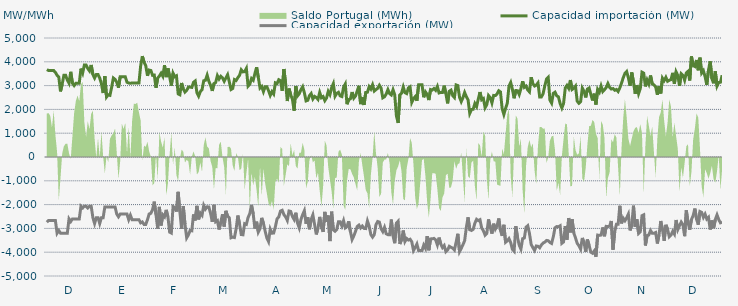
| Category | Capacidad importación (MW) | Capacidad exportación (MW) |
|---|---|---|
| 0 | 3670.833 | -2741.667 |
| 1900-01-01 | 3633.333 | -2666.667 |
| 1900-01-02 | 3633.333 | -2666.667 |
| 1900-01-03 | 3633.333 | -2666.667 |
| 1900-01-04 | 3633.333 | -2666.667 |
| 1900-01-05 | 3557.083 | -2666.667 |
| 1900-01-06 | 3433.333 | -3200 |
| 1900-01-07 | 3358.333 | -3087.5 |
| 1900-01-08 | 2756.25 | -3200 |
| 1900-01-09 | 3066.667 | -3200 |
| 1900-01-10 | 3433.333 | -3200 |
| 1900-01-11 | 3433.333 | -3200 |
| 1900-01-12 | 3232.417 | -3200 |
| 1900-01-13 | 3100 | -2600 |
| 1900-01-14 | 3579.167 | -2712.5 |
| 1900-01-15 | 3100 | -2600 |
| 1900-01-16 | 3000.75 | -2600 |
| 1900-01-17 | 3100 | -2600 |
| 1900-01-18 | 3100 | -2600 |
| 1900-01-19 | 3100 | -2600 |
| 1900-01-20 | 3712.917 | -2066.667 |
| 1900-01-21 | 3527.083 | -2141.667 |
| 1900-01-22 | 3866.667 | -2066.667 |
| 1900-01-23 | 3866.667 | -2066.667 |
| 1900-01-24 | 3716.667 | -2141.667 |
| 1900-01-25 | 3616.667 | -2066.667 |
| 1900-01-26 | 3866.667 | -2066.667 |
| 1900-01-27 | 3466.667 | -2550 |
| 1900-01-28 | 3316.667 | -2795.833 |
| 1900-01-29 | 3466.667 | -2550 |
| 1900-01-30 | 3466.667 | -2550 |
| 1900-01-31 | 3316.667 | -2795.833 |
| 1900-02-01 | 3082.167 | -2550 |
| 1900-02-02 | 2687.5 | -2550 |
| 1900-02-03 | 3400 | -2100 |
| 1900-02-04 | 2520.833 | -2100 |
| 1900-02-05 | 2614.583 | -2100 |
| 1900-02-06 | 2591.25 | -2100 |
| 1900-02-07 | 2932.083 | -2100 |
| 1900-02-08 | 3318.75 | -2100 |
| 1900-02-09 | 3262.5 | -2100 |
| 1900-02-10 | 3139.583 | -2400 |
| 1900-02-11 | 2912.5 | -2512.5 |
| 1900-02-12 | 3366.667 | -2400 |
| 1900-02-13 | 3366.667 | -2400 |
| 1900-02-14 | 3366.667 | -2400 |
| 1900-02-15 | 3366.667 | -2400 |
| 1900-02-16 | 3139.583 | -2400 |
| 1900-02-17 | 3108.333 | -2633.333 |
| 1900-02-18 | 3100 | -2445.833 |
| 1900-02-19 | 3108.333 | -2633.333 |
| 1900-02-20 | 3108.333 | -2633.333 |
| 1900-02-21 | 3108.333 | -2633.333 |
| 1900-02-22 | 3108.333 | -2633.333 |
| 1900-02-23 | 3108.333 | -2633.333 |
| 1900-02-24 | 3822.917 | -2766.667 |
| 1900-02-25 | 4239.583 | -2729.167 |
| 1900-02-26 | 3979.167 | -2833.333 |
| 1900-02-27 | 3841.667 | -2833.333 |
| 1900-02-28 | 3414.375 | -2634.375 |
| 1900-02-28 | 3652.5 | -2392.5 |
| 1900-03-01 | 3633.75 | -2364.375 |
| 1900-03-02 | 3431.25 | -2212.5 |
| 1900-03-03 | 3442.5 | -1876.875 |
| 1900-03-04 | 2908.125 | -2420.625 |
| 1900-03-05 | 3318.75 | -3009.375 |
| 1900-03-06 | 3401.25 | -2096.25 |
| 1900-03-07 | 3519.375 | -2876.25 |
| 1900-03-08 | 3392.5 | -2430 |
| 1900-03-09 | 3856.875 | -2512.5 |
| 1900-03-10 | 3356.25 | -2221.875 |
| 1900-03-11 | 3727.5 | -2516.25 |
| 1900-03-12 | 3372.5 | -3157.5 |
| 1900-03-13 | 3000.208 | -3195 |
| 1900-03-14 | 3522.083 | -2079.375 |
| 1900-03-15 | 3371.667 | -2122.5 |
| 1900-03-16 | 3412.5 | -2291.25 |
| 1900-03-17 | 2653.125 | -1464.375 |
| 1900-03-18 | 2615 | -2298.75 |
| 1900-03-19 | 3110.625 | -3018.75 |
| 1900-03-20 | 2861.792 | -2062.5 |
| 1900-03-21 | 2726.042 | -2823.75 |
| 1900-03-22 | 2799.583 | -3397.5 |
| 1900-03-23 | 2936.25 | -3273.75 |
| 1900-03-24 | 2938.125 | -3091.875 |
| 1900-03-25 | 2925 | -3101.25 |
| 1900-03-26 | 3136.875 | -2413.125 |
| 1900-03-27 | 3195.208 | -2666.25 |
| 1900-03-28 | 2702.083 | -2053.125 |
| 1900-03-29 | 2556.042 | -2621.25 |
| 1900-03-30 | 2748.75 | -2355 |
| 1900-03-31 | 2825.625 | -2448.75 |
| 1900-04-01 | 3204.375 | -2034.375 |
| 1900-04-02 | 3223.333 | -2188.125 |
| 1900-04-03 | 3440.625 | -2092.5 |
| 1900-04-04 | 3180 | -2100 |
| 1900-04-05 | 3016.875 | -2368.125 |
| 1900-04-06 | 2777.292 | -2722.5 |
| 1900-04-07 | 3084.375 | -2008.125 |
| 1900-04-08 | 3130.833 | -2720.625 |
| 1900-04-09 | 3418.75 | -2671.875 |
| 1900-04-10 | 3277.917 | -3046.875 |
| 1900-04-11 | 3390.833 | -2735.625 |
| 1900-04-12 | 3326.25 | -2407.5 |
| 1900-04-13 | 3180 | -2921.25 |
| 1900-04-14 | 3320.625 | -2262.708 |
| 1900-04-15 | 3457.5 | -2488.125 |
| 1900-04-16 | 3158.75 | -2557.5 |
| 1900-04-17 | 2836.25 | -3393.75 |
| 1900-04-18 | 2879.167 | -3365.625 |
| 1900-04-19 | 3254.167 | -3384.375 |
| 1900-04-20 | 3214.167 | -3018.75 |
| 1900-04-21 | 3335.625 | -2460 |
| 1900-04-22 | 3429.375 | -2818.125 |
| 1900-04-23 | 3663.75 | -3258.75 |
| 1900-04-24 | 3577.583 | -3268.125 |
| 1900-04-25 | 3586.875 | -2801.25 |
| 1900-04-26 | 3721.875 | -2831.25 |
| 1900-04-27 | 2977.5 | -2542.5 |
| 1900-04-28 | 3058.043 | -2379.13 |
| 1900-04-29 | 3294.375 | -2013.75 |
| 1900-04-30 | 3223.125 | -2388.75 |
| 1900-05-01 | 3506.25 | -3005.625 |
| 1900-05-02 | 3770.625 | -2718.75 |
| 1900-05-03 | 3346.875 | -3153.75 |
| 1900-05-04 | 2898.75 | -3009.375 |
| 1900-05-05 | 2966.25 | -2556.708 |
| 1900-05-06 | 2745.417 | -2786.25 |
| 1900-05-07 | 2951.25 | -3112.083 |
| 1900-05-08 | 2955 | -3401.25 |
| 1900-05-09 | 2788.125 | -3553.125 |
| 1900-05-10 | 2587.5 | -3033.75 |
| 1900-05-11 | 2745 | -3200.625 |
| 1900-05-12 | 2645.625 | -3195 |
| 1900-05-13 | 3116.25 | -2932.5 |
| 1900-05-14 | 3084.375 | -2598.75 |
| 1900-05-15 | 3247.5 | -2520 |
| 1900-05-16 | 3208.125 | -2272.5 |
| 1900-05-17 | 2782.708 | -2238.75 |
| 1900-05-18 | 3697.5 | -2418.75 |
| 1900-05-19 | 3103.125 | -2514.375 |
| 1900-05-20 | 2351.667 | -2662.5 |
| 1900-05-21 | 2876.25 | -2268.75 |
| 1900-05-22 | 2613.75 | -2287.5 |
| 1900-05-23 | 2422.5 | -2499.375 |
| 1900-05-24 | 1945.5 | -2625 |
| 1900-05-25 | 2981.25 | -2341.875 |
| 1900-05-26 | 2567.917 | -2775 |
| 1900-05-27 | 2658.542 | -2977.5 |
| 1900-05-28 | 2829.375 | -2626.875 |
| 1900-05-29 | 2951.25 | -2420.625 |
| 1900-05-30 | 2701.875 | -2257.5 |
| 1900-05-31 | 2356.875 | -2804.792 |
| 1900-06-01 | 2381.875 | -2527.5 |
| 1900-06-02 | 2578.125 | -3035.625 |
| 1900-06-03 | 2666.25 | -2621.042 |
| 1900-06-04 | 2439.583 | -2431.875 |
| 1900-06-05 | 2546.667 | -2835 |
| 1900-06-06 | 2503.125 | -3253.125 |
| 1900-06-07 | 2418.75 | -2985 |
| 1900-06-08 | 2711.25 | -2516.25 |
| 1900-06-09 | 2490 | -2932.5 |
| 1900-06-10 | 2538.75 | -3144.375 |
| 1900-06-11 | 2367.708 | -2306.25 |
| 1900-06-12 | 2476.875 | -2730 |
| 1900-06-13 | 2754.375 | -2460 |
| 1900-06-14 | 2620.833 | -3533.333 |
| 1900-06-15 | 2916.875 | -2297.5 |
| 1900-06-16 | 3082.5 | -3063.75 |
| 1900-06-17 | 2553.75 | -3120 |
| 1900-06-18 | 2671.875 | -3043.125 |
| 1900-06-19 | 2716.875 | -2722.5 |
| 1900-06-20 | 2568.75 | -2724.375 |
| 1900-06-21 | 2540.625 | -2896.875 |
| 1900-06-22 | 2938.125 | -2677.5 |
| 1900-06-23 | 3066.667 | -2979.167 |
| 1900-06-24 | 2218.125 | -2926.875 |
| 1900-06-25 | 2411.25 | -2701.875 |
| 1900-06-26 | 2443.125 | -3125.625 |
| 1900-06-27 | 2729.167 | -3466.667 |
| 1900-06-28 | 2471.25 | -3315 |
| 1900-06-29 | 2561.875 | -3127.375 |
| 1900-06-30 | 2778.75 | -2917.5 |
| 1900-07-01 | 2992.5 | -2861.25 |
| 1900-07-02 | 2221.875 | -2981.25 |
| 1900-07-03 | 2505 | -2900.625 |
| 1900-07-04 | 2187.5 | -3000 |
| 1900-07-05 | 2711.75 | -3007.5 |
| 1900-07-06 | 2723.125 | -2684.417 |
| 1900-07-07 | 2956.125 | -2899.25 |
| 1900-07-08 | 2855.625 | -3256.875 |
| 1900-07-09 | 3033.333 | -3366.667 |
| 1900-07-10 | 2771.25 | -3262.5 |
| 1900-07-11 | 2832.375 | -2842.5 |
| 1900-07-12 | 2887.5 | -2711.042 |
| 1900-07-13 | 3015 | -2735.625 |
| 1900-07-14 | 2893.125 | -3015 |
| 1900-07-15 | 2486.25 | -3135 |
| 1900-07-16 | 2529.375 | -2958.75 |
| 1900-07-17 | 2643.75 | -3226.875 |
| 1900-07-18 | 2831.667 | -3261.75 |
| 1900-07-19 | 2662.25 | -3262.25 |
| 1900-07-20 | 2606.25 | -2627.792 |
| 1900-07-21 | 2823.75 | -3316.875 |
| 1900-07-22 | 2608.125 | -3622.5 |
| 1900-07-23 | 1721.458 | -2778.75 |
| 1900-07-24 | 1429.792 | -2700 |
| 1900-07-25 | 2611.875 | -3654.375 |
| 1900-07-26 | 2683.125 | -3478.125 |
| 1900-07-27 | 2941.875 | -3088.125 |
| 1900-07-28 | 2701.042 | -3549.167 |
| 1900-07-29 | 2664.375 | -3423.75 |
| 1900-07-30 | 2900.625 | -3487.5 |
| 1900-07-31 | 2951.25 | -3455.625 |
| 1900-08-01 | 2295 | -3562.5 |
| 1900-08-02 | 2445 | -3930 |
| 1900-08-03 | 2535 | -3798.75 |
| 1900-08-04 | 2364.375 | -3654.375 |
| 1900-08-05 | 3033.333 | -3933.333 |
| 1900-08-06 | 3033.333 | -3933.333 |
| 1900-08-07 | 3033.333 | -3933.333 |
| 1900-08-08 | 2508.75 | -3703.125 |
| 1900-08-09 | 2735.625 | -3838.125 |
| 1900-08-10 | 2628.75 | -3326.25 |
| 1900-08-11 | 2392.5 | -3918.75 |
| 1900-08-12 | 2835 | -3440.625 |
| 1900-08-13 | 2812.5 | -3438.75 |
| 1900-08-14 | 2880 | -3420 |
| 1900-08-15 | 2803.125 | -3481.875 |
| 1900-08-16 | 2964.375 | -3691.875 |
| 1900-08-17 | 2690.625 | -3386.25 |
| 1900-08-18 | 2715 | -3656.25 |
| 1900-08-19 | 2711.25 | -3804.375 |
| 1900-08-20 | 2998.125 | -3720 |
| 1900-08-21 | 2660.625 | -3978.75 |
| 1900-08-22 | 2253.75 | -3907.5 |
| 1900-08-23 | 2760 | -3751.875 |
| 1900-08-24 | 2808.75 | -3796.875 |
| 1900-08-25 | 2580 | -3828.75 |
| 1900-08-26 | 2499.375 | -3907.5 |
| 1900-08-27 | 3028.125 | -3577.5 |
| 1900-08-28 | 3001.875 | -3226.875 |
| 1900-08-29 | 2511.25 | -3976.875 |
| 1900-08-30 | 2326.875 | -3840 |
| 1900-08-31 | 2491.875 | -3684.375 |
| 1900-09-01 | 2710.208 | -3515.417 |
| 1900-09-02 | 2535 | -2956.875 |
| 1900-09-03 | 2401.875 | -2535 |
| 1900-09-04 | 1831.875 | -3056.25 |
| 1900-09-05 | 1995 | -3086.25 |
| 1900-09-06 | 2006.875 | -3037.5 |
| 1900-09-07 | 2244.375 | -2777.5 |
| 1900-09-08 | 2118.75 | -2619.375 |
| 1900-09-09 | 2437.5 | -2673.75 |
| 1900-09-10 | 2728.125 | -2634.375 |
| 1900-09-11 | 2403.75 | -2986.875 |
| 1900-09-12 | 2454.375 | -3099.375 |
| 1900-09-13 | 2071.875 | -3285 |
| 1900-09-14 | 2201.125 | -3208.125 |
| 1900-09-15 | 2582.958 | -2621.458 |
| 1900-09-16 | 2493.625 | -2943.125 |
| 1900-09-17 | 2270.5 | -3218.75 |
| 1900-09-18 | 2587.5 | -2803.125 |
| 1900-09-19 | 2581.875 | -3030 |
| 1900-09-20 | 2651.25 | -2895 |
| 1900-09-21 | 2784.375 | -2583.75 |
| 1900-09-22 | 2733.75 | -3084.375 |
| 1900-09-23 | 2030.625 | -3314.375 |
| 1900-09-24 | 1787.25 | -2849.375 |
| 1900-09-25 | 2040.625 | -3583.667 |
| 1900-09-26 | 2251.875 | -3525 |
| 1900-09-27 | 2977.5 | -3429.375 |
| 1900-09-28 | 3129.375 | -3594.583 |
| 1900-09-29 | 2844.375 | -3877.5 |
| 1900-09-30 | 2467.5 | -3956.25 |
| 1900-10-01 | 2793.75 | -2904.375 |
| 1900-10-02 | 2786.25 | -3382.5 |
| 1900-10-03 | 2626.875 | -3703.125 |
| 1900-10-04 | 2870.625 | -3871.875 |
| 1900-10-05 | 3183.75 | -3431.25 |
| 1900-10-06 | 2926.875 | -3403.125 |
| 1900-10-07 | 2979.375 | -2951.25 |
| 1900-10-08 | 2814.375 | -2887.5 |
| 1900-10-09 | 2737.5 | -3208.125 |
| 1900-10-10 | 3352.5 | -3671.25 |
| 1900-10-11 | 3078.75 | -3808.125 |
| 1900-10-12 | 2983.125 | -3926.25 |
| 1900-10-13 | 3018.75 | -3738.75 |
| 1900-10-14 | 3114.375 | -3751.875 |
| 1900-10-15 | 2520 | -3813.75 |
| 1900-10-16 | 2523.75 | -3697.292 |
| 1900-10-17 | 2658.542 | -3615 |
| 1900-10-18 | 2986.875 | -3575.625 |
| 1900-10-19 | 3273.625 | -3505.833 |
| 1900-10-20 | 3348.75 | -3519.375 |
| 1900-10-21 | 2390.625 | -3592.5 |
| 1900-10-22 | 2265 | -3631.875 |
| 1900-10-23 | 2675.625 | -3346.875 |
| 1900-10-24 | 2724.375 | -2973.75 |
| 1900-10-25 | 2571.875 | -2923.125 |
| 1900-10-26 | 2527.5 | -2930.042 |
| 1900-10-27 | 2244.375 | -2888.708 |
| 1900-10-28 | 2059.333 | -3626.25 |
| 1900-10-29 | 2244.375 | -3570 |
| 1900-10-30 | 2900 | -2900 |
| 1900-10-31 | 3007.5 | -3476.25 |
| 1900-11-01 | 2885.625 | -2562.917 |
| 1900-11-02 | 3233.333 | -3166.667 |
| 1900-11-03 | 2836.875 | -2610.208 |
| 1900-11-04 | 2889.375 | -3189.375 |
| 1900-11-05 | 2979.375 | -3399.375 |
| 1900-11-06 | 2345.625 | -3628.125 |
| 1900-11-07 | 2257.5 | -3725.625 |
| 1900-11-08 | 2323.125 | -3871.875 |
| 1900-11-09 | 2895 | -3401.25 |
| 1900-11-10 | 2760 | -3600 |
| 1900-11-11 | 2503.125 | -3987.75 |
| 1900-11-12 | 2855.625 | -3466.875 |
| 1900-11-13 | 2898.75 | -3720 |
| 1900-11-14 | 2628.75 | -3997.5 |
| 1900-11-15 | 2375.625 | -4044.375 |
| 1900-11-16 | 2660.625 | -3947.875 |
| 1900-11-17 | 2205 | -4190.625 |
| 1900-11-18 | 2840.625 | -3281.25 |
| 1900-11-19 | 2726.25 | -3292.5 |
| 1900-11-20 | 2983.125 | -3279.375 |
| 1900-11-21 | 2750.625 | -2960.625 |
| 1900-11-22 | 2827.5 | -3330 |
| 1900-11-23 | 2917.5 | -2915.625 |
| 1900-11-24 | 3087 | -2927.6 |
| 1900-11-25 | 2928.75 | -2903.792 |
| 1900-11-26 | 2857.5 | -2686.875 |
| 1900-11-27 | 2874.375 | -3894.375 |
| 1900-11-28 | 2803.125 | -3136.875 |
| 1900-11-29 | 2836.875 | -2825.625 |
| 1900-11-30 | 2752.5 | -2825.625 |
| 1900-12-01 | 2906.25 | -2049.375 |
| 1900-12-02 | 3106.875 | -2788.125 |
| 1900-12-03 | 3331.875 | -2572.5 |
| 1900-12-04 | 3513.75 | -2677.5 |
| 1900-12-05 | 3590.625 | -2555.625 |
| 1900-12-06 | 3328.125 | -2400 |
| 1900-12-07 | 2992.5 | -3084.375 |
| 1900-12-08 | 3551.25 | -2874.375 |
| 1900-12-09 | 3150 | -2045.625 |
| 1900-12-10 | 2658.75 | -2932.5 |
| 1900-12-11 | 3023.625 | -2619.5 |
| 1900-12-12 | 2664.375 | -3210 |
| 1900-12-13 | 2872.5 | -3142.5 |
| 1900-12-14 | 3564.375 | -2467.5 |
| 1900-12-15 | 3525 | -2430 |
| 1900-12-16 | 2966.25 | -3718.125 |
| 1900-12-17 | 3236.25 | -3300 |
| 1900-12-18 | 3069.375 | -3275.625 |
| 1900-12-19 | 3425.625 | -3086.25 |
| 1900-12-20 | 3071.25 | -3204.375 |
| 1900-12-21 | 3031.875 | -3206.25 |
| 1900-12-22 | 2947.5 | -3172.5 |
| 1900-12-23 | 2613.75 | -3633.75 |
| 1900-12-24 | 2977.5 | -3258.75 |
| 1900-12-25 | 2670 | -2689.583 |
| 1900-12-26 | 3315 | -3045 |
| 1900-12-27 | 3206.25 | -3523.125 |
| 1900-12-28 | 3348.75 | -2850 |
| 1900-12-29 | 3181.875 | -3038.125 |
| 1900-12-30 | 3225 | -3354.375 |
| 1900-12-31 | 3249.375 | -3283.125 |
| 1901-01-01 | 3536.25 | -3127.5 |
| 1901-01-02 | 3078.75 | -3241.875 |
| 1901-01-03 | 3578.333 | -2647.5 |
| 1901-01-04 | 3425.625 | -3048.75 |
| 1901-01-05 | 2990 | -2885.625 |
| 1901-01-06 | 3498.75 | -2733.75 |
| 1901-01-07 | 3433.125 | -2840.625 |
| 1901-01-08 | 3225 | -3326.25 |
| 1901-01-09 | 3534.375 | -2242.5 |
| 1901-01-10 | 3600 | -2760 |
| 1901-01-11 | 3215.625 | -3054.375 |
| 1901-01-12 | 4224.75 | -2629.167 |
| 1901-01-13 | 3843.75 | -2460 |
| 1901-01-14 | 3802.5 | -2167.5 |
| 1901-01-15 | 4076.25 | -2617.5 |
| 1901-01-16 | 3645 | -2842.5 |
| 1901-01-17 | 4173.75 | -2293.125 |
| 1901-01-18 | 3528.75 | -2328.75 |
| 1901-01-19 | 3628.125 | -2536.875 |
| 1901-01-20 | 3371.25 | -2401.875 |
| 1901-01-21 | 3033.75 | -2606.25 |
| 1901-01-22 | 3658.125 | -2535 |
| 1901-01-23 | 4021.875 | -3046.875 |
| 1901-01-24 | 3286.875 | -2666.25 |
| 1901-01-25 | 3097.5 | -2992.5 |
| 1901-01-26 | 3598.125 | -2625 |
| 1901-01-27 | 2981.25 | -2431.875 |
| 1901-01-28 | 3131.042 | -2628.75 |
| 1901-01-29 | 3142.5 | -2765.625 |
| 1901-01-30 | 3436.875 | -2737.5 |